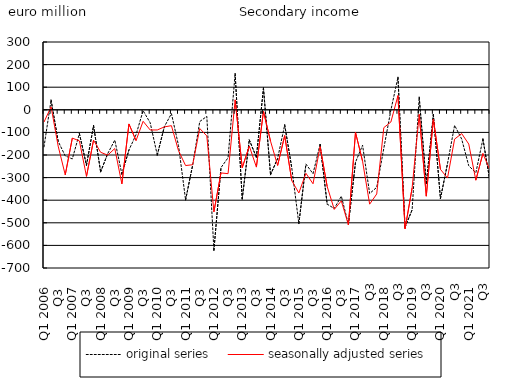
| Category | original series | seasonally adjusted series |
|---|---|---|
| Q1 2006 | -163.95 | -54.186 |
| Q2  | 43.04 | 13.309 |
| Q3  | -139.363 | -160.612 |
| Q4  | -204.113 | -287.902 |
| Q1 2007 | -217.383 | -125.228 |
| Q2  | -105.403 | -137.595 |
| Q3  | -245.072 | -294.53 |
| Q4  | -69.989 | -134.37 |
| Q1 2008 | -274.697 | -188 |
| Q2  | -194.015 | -200.694 |
| Q3  | -133.945 | -171.39 |
| Q4  | -284.445 | -327.809 |
| Q1 2009 | -177.727 | -62.624 |
| Q2  | -110.177 | -136.246 |
| Q3  | -3.84 | -50.856 |
| Q4  | -57.53 | -89.296 |
| Q1 2010 | -200.284 | -89.231 |
| Q2  | -74.766 | -75.701 |
| Q3  | -16.851 | -70.213 |
| Q4  | -157.657 | -180.942 |
| Q1 2011 | -398.787 | -246.689 |
| Q2  | -244.88 | -243.039 |
| Q3  | -52.106 | -82.761 |
| Q4  | -28.94 | -115.67 |
| Q1 2012 | -622.029 | -451.653 |
| Q2  | -255.825 | -279.317 |
| Q3  | -212.102 | -282.581 |
| Q4  | 160.167 | 43.933 |
| Q1 2013 | -394.085 | -256.346 |
| Q2  | -133.198 | -160.634 |
| Q3  | -210.16 | -253.525 |
| Q4  | 96.369 | -6.867 |
| Q1 2014 | -287.396 | -138.918 |
| Q2  | -215.622 | -246.376 |
| Q3  | -67.014 | -114.23 |
| Q4  | -257.099 | -313.305 |
| Q1 2015 | -503.701 | -368.077 |
| Q2  | -240.211 | -281.086 |
| Q3  | -282.752 | -327.332 |
| Q4 | -153.337 | -163.019 |
| Q1 2016 | -417.43 | -339.489 |
| Q2  | -436.839 | -440.622 |
| Q3  | -382.181 | -403.013 |
| Q4 | -507.067 | -509.542 |
| Q1 2017 | -232.017 | -99.769 |
| Q2  | -156.557 | -227.51 |
| Q3 | -370.521 | -417.509 |
| Q4 | -343.039 | -372.422 |
| Q1 2018 | -170.281 | -79.061 |
| Q2  | -1.298 | -53.988 |
| Q3 | 143.898 | 62.812 |
| Q4 | -519.123 | -527.017 |
| Q1 2019 | -442.73 | -345.636 |
| Q2  | 55.809 | -20.358 |
| Q3 | -326.46 | -382.194 |
| Q4 | -21.148 | -40.737 |
| Q1 2020 | -392.804 | -263.411 |
| Q2  | -237.951 | -301.833 |
| Q3 | -68.832 | -129.67 |
| Q4 | -129.487 | -105.229 |
| Q1 2021 | -247.874 | -151.56 |
| Q2  | -278.605 | -311.505 |
| Q3 | -129.359 | -193.387 |
| Q4 | -316.412 | -267.92 |